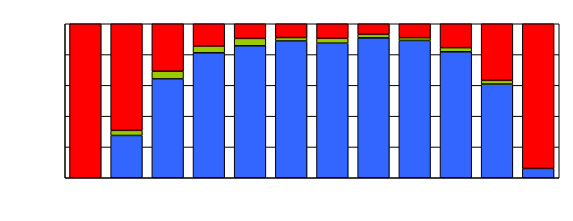
| Category | Series 0 | Series 1 | Series 2 |
|---|---|---|---|
| 0 | 0 | 0 | 268 |
| 1 | 25 | 3 | 63 |
| 2 | 52 | 4 | 25 |
| 3 | 73 | 4 | 13 |
| 4 | 108 | 6 | 12 |
| 5 | 119 | 3 | 12 |
| 6 | 111 | 4 | 12 |
| 7 | 119 | 3 | 9 |
| 8 | 148 | 3 | 15 |
| 9 | 153 | 5 | 29 |
| 10 | 101 | 4 | 61 |
| 11 | 32 | 0 | 499 |